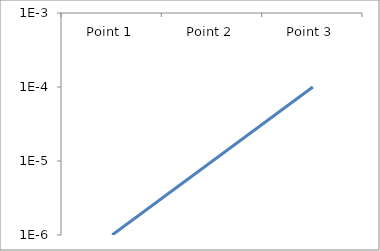
| Category | Series 5 |
|---|---|
| Point 1 | 0 |
| Point 2 | 0 |
| Point 3 | 0 |